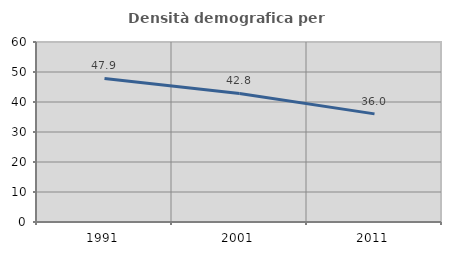
| Category | Densità demografica |
|---|---|
| 1991.0 | 47.87 |
| 2001.0 | 42.839 |
| 2011.0 | 36.044 |